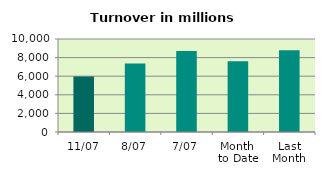
| Category | Series 0 |
|---|---|
| 11/07 | 5956.46 |
| 8/07 | 7373.032 |
| 7/07 | 8721.979 |
| Month 
to Date | 7600.05 |
| Last
Month | 8790.45 |